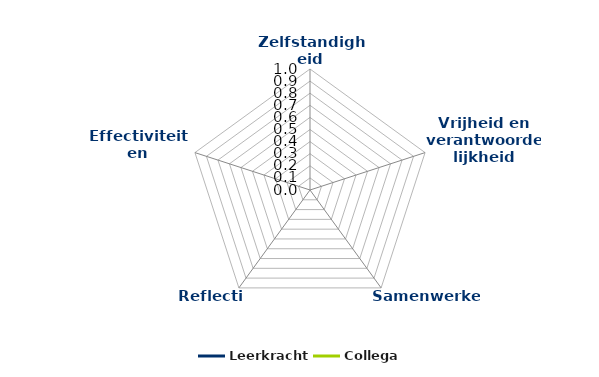
| Category | Leerkracht | Collega |
|---|---|---|
| Zelfstandigheid | 0 | 0 |
| Vrijheid en verantwoordelijkheid | 0 | 0 |
| Samenwerken | 0 | 0 |
| Reflectie | 0 | 0 |
| Effectiviteit en doelmatigheid | 0 | 0 |